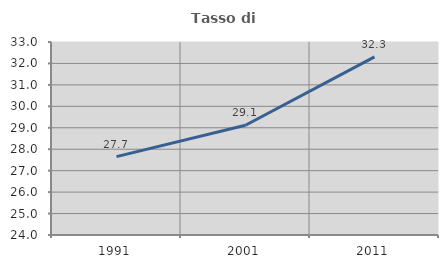
| Category | Tasso di occupazione   |
|---|---|
| 1991.0 | 27.654 |
| 2001.0 | 29.116 |
| 2011.0 | 32.304 |